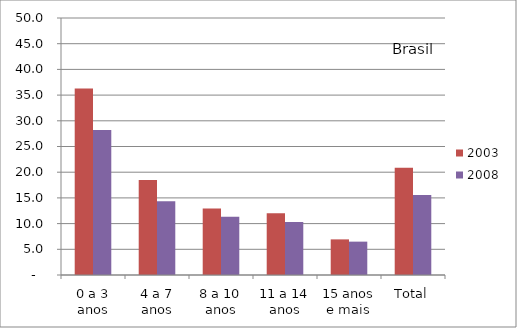
| Category | 2003 | 2008 |
|---|---|---|
| 0 a 3 anos | 36.29 | 28.23 |
| 4 a 7 anos | 18.49 | 14.34 |
| 8 a 10 anos | 12.96 | 11.32 |
| 11 a 14 anos | 12.03 | 10.31 |
| 15 anos e mais | 6.93 | 6.49 |
| Total | 20.88 | 15.54 |